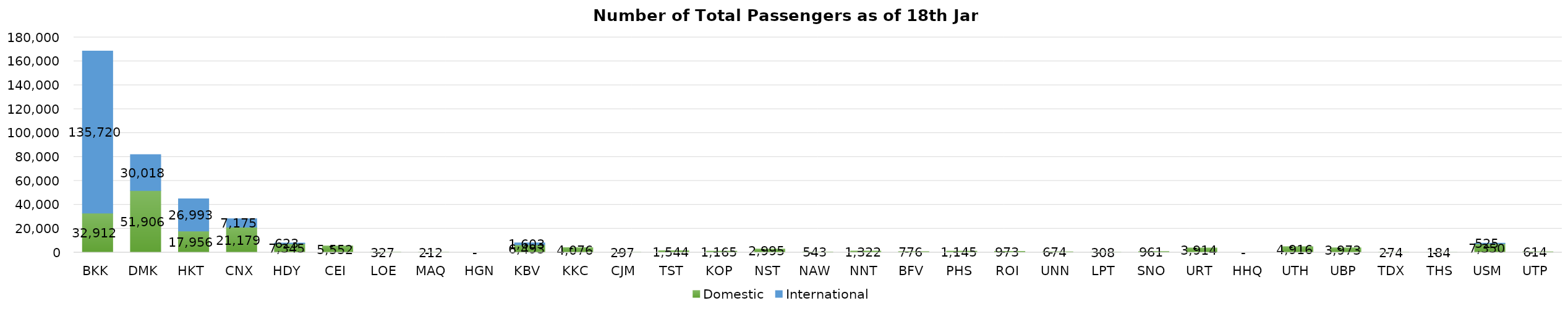
| Category | Domestic | International |
|---|---|---|
| BKK | 32912 | 135720 |
| DMK | 51906 | 30018 |
| HKT | 17956 | 26993 |
| CNX | 21179 | 7175 |
| HDY | 7345 | 623 |
| CEI | 5552 | 0 |
| LOE | 327 | 0 |
| MAQ | 212 | 0 |
| HGN | 0 | 0 |
| KBV | 6493 | 1603 |
| KKC | 4076 | 0 |
| CJM | 297 | 0 |
| TST | 1544 | 0 |
| KOP | 1165 | 0 |
| NST | 2995 | 0 |
| NAW | 543 | 0 |
| NNT | 1322 | 0 |
| BFV | 776 | 0 |
| PHS | 1145 | 0 |
| ROI | 973 | 0 |
| UNN | 674 | 0 |
| LPT | 308 | 0 |
| SNO | 961 | 0 |
| URT | 3914 | 0 |
| HHQ | 0 | 0 |
| UTH | 4916 | 0 |
| UBP | 3973 | 0 |
| TDX | 274 | 0 |
| THS | 184 | 0 |
| USM | 7350 | 525 |
| UTP | 614 | 0 |